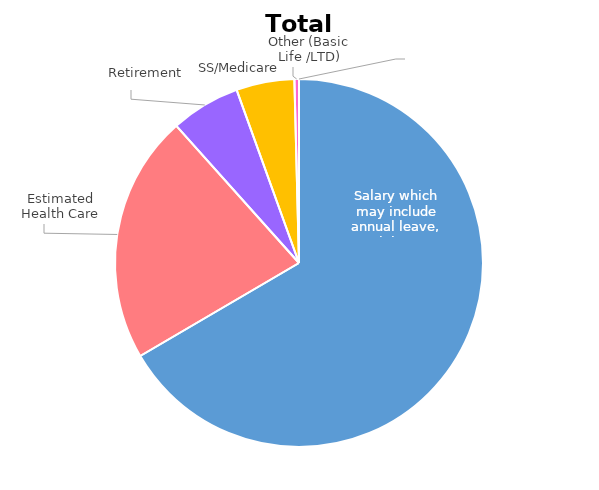
| Category | Series 0 |
|---|---|
| Salary which may include annual leave, sick leave, and holidays | 0.665 |
| Estimated Health Care | 0.218 |
| Retirement | 0.061 |
| SS/Medicare | 0.051 |
| Other (Basic Life /LTD) | 0.004 |